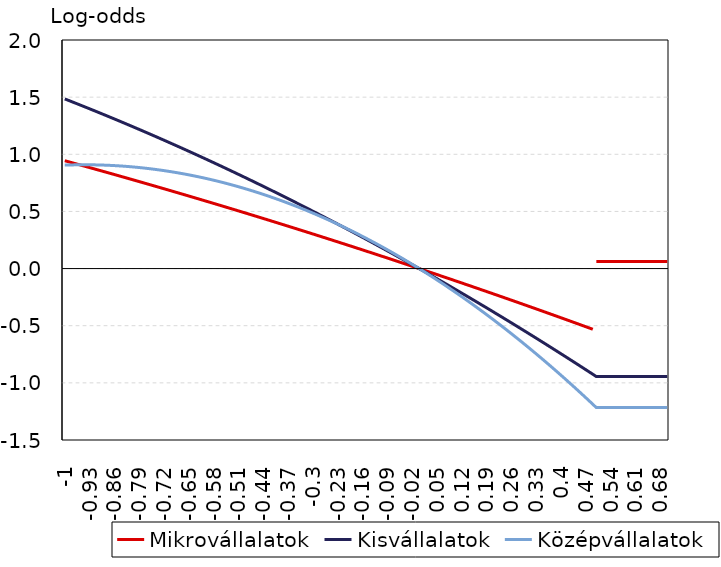
| Category | Mikrovállalatok | Kisvállalatok | Középvállalatok |
|---|---|---|---|
| -1.0 | 0.944 | 1.484 | 0.905 |
| -0.99 | 0.935 | 1.472 | 0.906 |
| -0.98 | 0.927 | 1.46 | 0.907 |
| -0.97 | 0.918 | 1.448 | 0.908 |
| -0.96 | 0.909 | 1.435 | 0.908 |
| -0.95 | 0.901 | 1.423 | 0.908 |
| -0.94 | 0.892 | 1.411 | 0.908 |
| -0.93 | 0.884 | 1.398 | 0.908 |
| -0.92 | 0.875 | 1.386 | 0.908 |
| -0.91 | 0.866 | 1.373 | 0.907 |
| -0.9 | 0.858 | 1.36 | 0.906 |
| -0.89 | 0.849 | 1.348 | 0.905 |
| -0.88 | 0.84 | 1.335 | 0.904 |
| -0.87 | 0.832 | 1.322 | 0.903 |
| -0.86 | 0.823 | 1.309 | 0.901 |
| -0.85 | 0.814 | 1.296 | 0.899 |
| -0.84 | 0.805 | 1.283 | 0.897 |
| -0.83 | 0.796 | 1.27 | 0.895 |
| -0.82 | 0.788 | 1.257 | 0.893 |
| -0.81 | 0.779 | 1.244 | 0.89 |
| -0.8 | 0.77 | 1.231 | 0.887 |
| -0.79 | 0.761 | 1.218 | 0.884 |
| -0.78 | 0.752 | 1.204 | 0.881 |
| -0.77 | 0.743 | 1.191 | 0.877 |
| -0.76 | 0.734 | 1.177 | 0.874 |
| -0.75 | 0.725 | 1.164 | 0.87 |
| -0.74 | 0.716 | 1.15 | 0.866 |
| -0.73 | 0.707 | 1.137 | 0.862 |
| -0.72 | 0.698 | 1.123 | 0.857 |
| -0.71 | 0.689 | 1.11 | 0.852 |
| -0.7 | 0.68 | 1.096 | 0.848 |
| -0.69 | 0.671 | 1.082 | 0.842 |
| -0.68 | 0.662 | 1.068 | 0.837 |
| -0.67 | 0.653 | 1.054 | 0.832 |
| -0.66 | 0.644 | 1.04 | 0.826 |
| -0.65 | 0.635 | 1.026 | 0.82 |
| -0.64 | 0.626 | 1.012 | 0.814 |
| -0.63 | 0.616 | 0.998 | 0.808 |
| -0.62 | 0.607 | 0.984 | 0.801 |
| -0.61 | 0.598 | 0.97 | 0.795 |
| -0.6 | 0.589 | 0.956 | 0.788 |
| -0.59 | 0.58 | 0.941 | 0.78 |
| -0.58 | 0.57 | 0.927 | 0.773 |
| -0.57 | 0.561 | 0.912 | 0.766 |
| -0.56 | 0.552 | 0.898 | 0.758 |
| -0.55 | 0.542 | 0.883 | 0.75 |
| -0.54 | 0.533 | 0.869 | 0.742 |
| -0.53 | 0.524 | 0.854 | 0.734 |
| -0.52 | 0.514 | 0.839 | 0.725 |
| -0.51 | 0.505 | 0.825 | 0.716 |
| -0.5 | 0.495 | 0.81 | 0.707 |
| -0.49 | 0.486 | 0.795 | 0.698 |
| -0.48 | 0.476 | 0.78 | 0.689 |
| -0.47 | 0.467 | 0.765 | 0.679 |
| -0.46 | 0.457 | 0.75 | 0.669 |
| -0.45 | 0.448 | 0.735 | 0.659 |
| -0.44 | 0.438 | 0.72 | 0.649 |
| -0.429999999999999 | 0.429 | 0.705 | 0.639 |
| -0.419999999999999 | 0.419 | 0.689 | 0.628 |
| -0.409999999999999 | 0.41 | 0.674 | 0.618 |
| -0.399999999999999 | 0.4 | 0.659 | 0.607 |
| -0.389999999999999 | 0.39 | 0.643 | 0.595 |
| -0.379999999999999 | 0.381 | 0.628 | 0.584 |
| -0.369999999999999 | 0.371 | 0.612 | 0.572 |
| -0.359999999999999 | 0.361 | 0.597 | 0.561 |
| -0.349999999999999 | 0.352 | 0.581 | 0.549 |
| -0.339999999999999 | 0.342 | 0.565 | 0.536 |
| -0.329999999999999 | 0.332 | 0.55 | 0.524 |
| -0.319999999999999 | 0.322 | 0.534 | 0.511 |
| -0.309999999999999 | 0.313 | 0.518 | 0.499 |
| -0.299999999999999 | 0.303 | 0.502 | 0.485 |
| -0.289999999999999 | 0.293 | 0.486 | 0.472 |
| -0.279999999999999 | 0.283 | 0.47 | 0.459 |
| -0.269999999999999 | 0.273 | 0.454 | 0.445 |
| -0.259999999999999 | 0.263 | 0.438 | 0.431 |
| -0.249999999999999 | 0.254 | 0.422 | 0.417 |
| -0.239999999999999 | 0.244 | 0.406 | 0.403 |
| -0.229999999999999 | 0.234 | 0.389 | 0.389 |
| -0.219999999999999 | 0.224 | 0.373 | 0.374 |
| -0.209999999999999 | 0.214 | 0.357 | 0.359 |
| -0.199999999999999 | 0.204 | 0.34 | 0.344 |
| -0.189999999999999 | 0.194 | 0.324 | 0.329 |
| -0.179999999999999 | 0.184 | 0.307 | 0.313 |
| -0.169999999999999 | 0.174 | 0.29 | 0.298 |
| -0.159999999999999 | 0.164 | 0.274 | 0.282 |
| -0.149999999999999 | 0.154 | 0.257 | 0.266 |
| -0.139999999999999 | 0.143 | 0.24 | 0.249 |
| -0.129999999999999 | 0.133 | 0.224 | 0.233 |
| -0.119999999999999 | 0.123 | 0.207 | 0.216 |
| -0.109999999999999 | 0.113 | 0.19 | 0.199 |
| -0.099999999999999 | 0.103 | 0.173 | 0.182 |
| -0.089999999999999 | 0.093 | 0.156 | 0.165 |
| -0.079999999999999 | 0.082 | 0.139 | 0.147 |
| -0.069999999999999 | 0.072 | 0.122 | 0.13 |
| -0.0599999999999991 | 0.062 | 0.104 | 0.112 |
| -0.049999999999999 | 0.052 | 0.087 | 0.094 |
| -0.039999999999999 | 0.041 | 0.07 | 0.075 |
| -0.029999999999999 | 0.031 | 0.052 | 0.057 |
| -0.019999999999999 | 0.021 | 0.035 | 0.038 |
| -0.00999999999999901 | 0.01 | 0.018 | 0.019 |
| 0.0 | 0 | 0 | 0 |
| 0.01 | -0.01 | -0.018 | -0.019 |
| 0.02 | -0.021 | -0.035 | -0.039 |
| 0.03 | -0.031 | -0.053 | -0.059 |
| 0.04 | -0.042 | -0.071 | -0.079 |
| 0.05 | -0.052 | -0.088 | -0.099 |
| 0.0600000000000001 | -0.063 | -0.106 | -0.119 |
| 0.0700000000000001 | -0.073 | -0.124 | -0.14 |
| 0.0800000000000001 | -0.084 | -0.142 | -0.16 |
| 0.0900000000000001 | -0.094 | -0.16 | -0.181 |
| 0.1 | -0.105 | -0.178 | -0.203 |
| 0.11 | -0.115 | -0.196 | -0.224 |
| 0.12 | -0.126 | -0.214 | -0.246 |
| 0.13 | -0.137 | -0.233 | -0.267 |
| 0.14 | -0.147 | -0.251 | -0.289 |
| 0.15 | -0.158 | -0.269 | -0.312 |
| 0.16 | -0.168 | -0.288 | -0.334 |
| 0.17 | -0.179 | -0.306 | -0.357 |
| 0.18 | -0.19 | -0.325 | -0.379 |
| 0.19 | -0.201 | -0.343 | -0.402 |
| 0.2 | -0.211 | -0.362 | -0.426 |
| 0.21 | -0.222 | -0.38 | -0.449 |
| 0.22 | -0.233 | -0.399 | -0.473 |
| 0.23 | -0.244 | -0.418 | -0.496 |
| 0.24 | -0.254 | -0.437 | -0.52 |
| 0.25 | -0.265 | -0.456 | -0.545 |
| 0.26 | -0.276 | -0.474 | -0.569 |
| 0.27 | -0.287 | -0.493 | -0.594 |
| 0.28 | -0.298 | -0.513 | -0.619 |
| 0.29 | -0.309 | -0.532 | -0.644 |
| 0.3 | -0.32 | -0.551 | -0.669 |
| 0.31 | -0.331 | -0.57 | -0.694 |
| 0.32 | -0.342 | -0.589 | -0.72 |
| 0.33 | -0.353 | -0.608 | -0.746 |
| 0.34 | -0.364 | -0.628 | -0.772 |
| 0.35 | -0.375 | -0.647 | -0.798 |
| 0.36 | -0.386 | -0.667 | -0.825 |
| 0.37 | -0.397 | -0.686 | -0.851 |
| 0.38 | -0.408 | -0.706 | -0.878 |
| 0.39 | -0.419 | -0.725 | -0.905 |
| 0.4 | -0.43 | -0.745 | -0.933 |
| 0.41 | -0.441 | -0.765 | -0.96 |
| 0.42 | -0.452 | -0.785 | -0.988 |
| 0.43 | -0.464 | -0.805 | -1.016 |
| 0.44 | -0.475 | -0.824 | -1.044 |
| 0.45 | -0.486 | -0.844 | -1.072 |
| 0.46 | -0.497 | -0.864 | -1.101 |
| 0.47 | -0.509 | -0.884 | -1.129 |
| 0.48 | -0.52 | -0.905 | -1.158 |
| 0.49 | -0.531 | -0.925 | -1.187 |
| 0.5 | 0.062 | -0.945 | -1.217 |
| 0.51 | 0.062 | -0.945 | -1.217 |
| 0.52 | 0.062 | -0.945 | -1.217 |
| 0.53 | 0.062 | -0.945 | -1.217 |
| 0.54 | 0.062 | -0.945 | -1.217 |
| 0.55 | 0.062 | -0.945 | -1.217 |
| 0.56 | 0.062 | -0.945 | -1.217 |
| 0.57 | 0.062 | -0.945 | -1.217 |
| 0.58 | 0.062 | -0.945 | -1.217 |
| 0.59 | 0.062 | -0.945 | -1.217 |
| 0.6 | 0.062 | -0.945 | -1.217 |
| 0.61 | 0.062 | -0.945 | -1.217 |
| 0.62 | 0.062 | -0.945 | -1.217 |
| 0.63 | 0.062 | -0.945 | -1.217 |
| 0.64 | 0.062 | -0.945 | -1.217 |
| 0.65 | 0.062 | -0.945 | -1.217 |
| 0.66 | 0.062 | -0.945 | -1.217 |
| 0.67 | 0.062 | -0.945 | -1.217 |
| 0.68 | 0.062 | -0.945 | -1.217 |
| 0.69 | 0.062 | -0.945 | -1.217 |
| 0.7 | 0.062 | -0.945 | -1.217 |